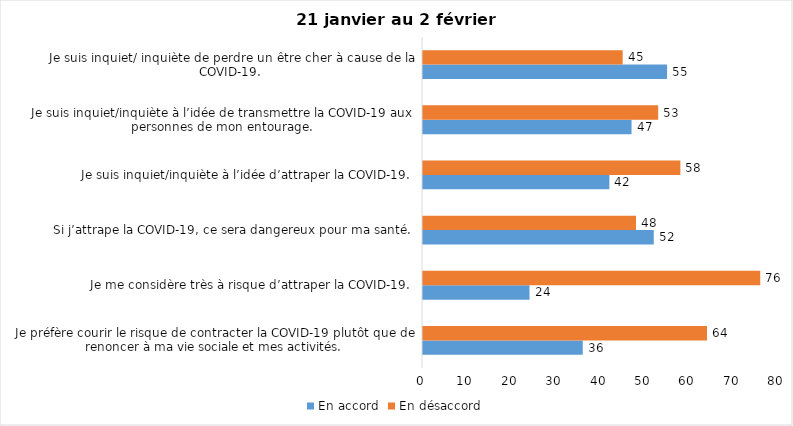
| Category | En accord | En désaccord |
|---|---|---|
| Je préfère courir le risque de contracter la COVID-19 plutôt que de renoncer à ma vie sociale et mes activités. | 36 | 64 |
| Je me considère très à risque d’attraper la COVID-19. | 24 | 76 |
| Si j’attrape la COVID-19, ce sera dangereux pour ma santé. | 52 | 48 |
| Je suis inquiet/inquiète à l’idée d’attraper la COVID-19. | 42 | 58 |
| Je suis inquiet/inquiète à l’idée de transmettre la COVID-19 aux personnes de mon entourage. | 47 | 53 |
| Je suis inquiet/ inquiète de perdre un être cher à cause de la COVID-19. | 55 | 45 |